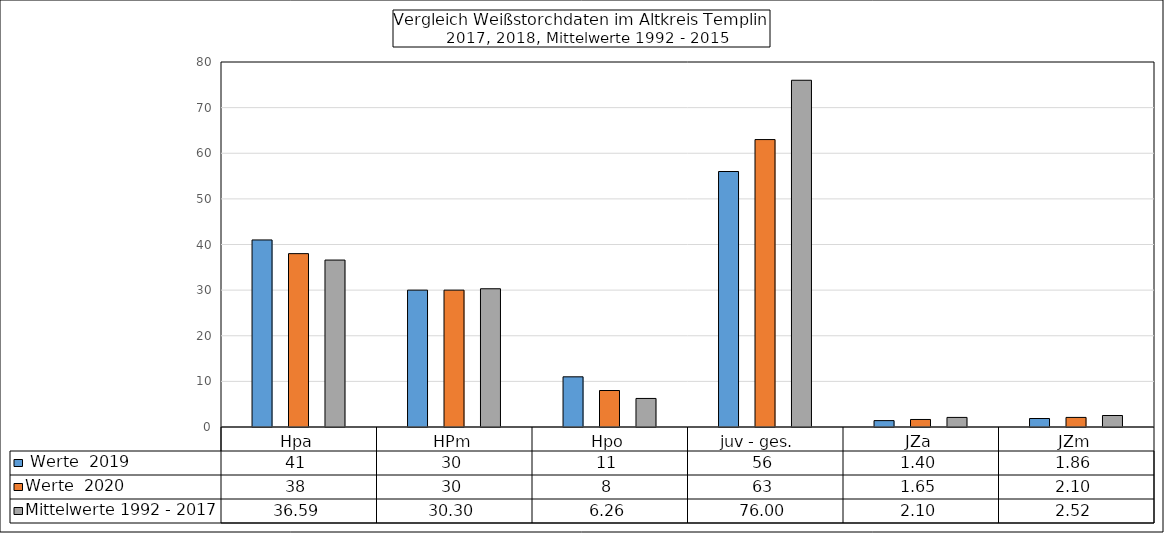
| Category |  Werte  2019 | Werte  2020 | Mittelwerte 1992 - 2017 |
|---|---|---|---|
| Hpa | 41 | 38 | 36.59 |
| HPm | 30 | 30 | 30.3 |
| Hpo | 11 | 8 | 6.26 |
| juv - ges.   | 56 | 63 | 76 |
| JZa | 1.4 | 1.65 | 2.1 |
| JZm | 1.86 | 2.1 | 2.52 |